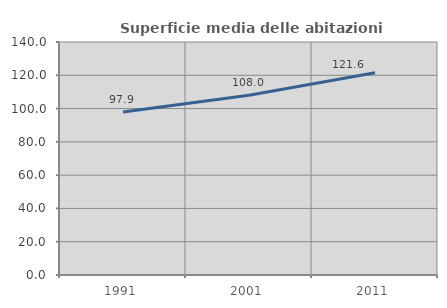
| Category | Superficie media delle abitazioni occupate |
|---|---|
| 1991.0 | 97.887 |
| 2001.0 | 107.971 |
| 2011.0 | 121.566 |